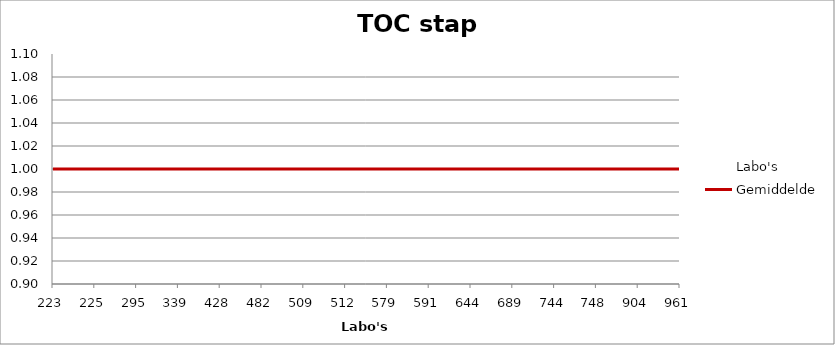
| Category | Labo's | Gemiddelde |
|---|---|---|
| 223.0 | 0.942 | 1 |
| 225.0 | 0.99 | 1 |
| 295.0 | 0.983 | 1 |
| 339.0 | 0.931 | 1 |
| 428.0 | 1.016 | 1 |
| 482.0 | 0.98 | 1 |
| 509.0 | 0.996 | 1 |
| 512.0 | 1.011 | 1 |
| 579.0 | 0.984 | 1 |
| 591.0 | 0.99 | 1 |
| 644.0 | 1.019 | 1 |
| 689.0 | 0.995 | 1 |
| 744.0 | 1.046 | 1 |
| 748.0 | 1.078 | 1 |
| 904.0 | 1.005 | 1 |
| 961.0 | 1.032 | 1 |